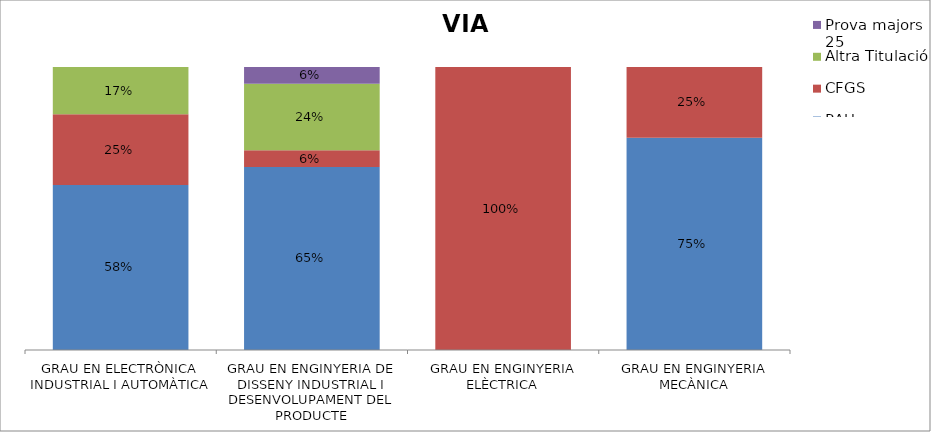
| Category | PAU | CFGS | Altra Titulació | Prova majors 25 |
|---|---|---|---|---|
| GRAU EN ELECTRÒNICA INDUSTRIAL I AUTOMÀTICA | 0.583 | 0.25 | 0.167 | 0 |
| GRAU EN ENGINYERIA DE DISSENY INDUSTRIAL I DESENVOLUPAMENT DEL PRODUCTE | 0.647 | 0.059 | 0.235 | 0.059 |
| GRAU EN ENGINYERIA ELÈCTRICA | 0 | 1 | 0 | 0 |
| GRAU EN ENGINYERIA MECÀNICA | 0.75 | 0.25 | 0 | 0 |